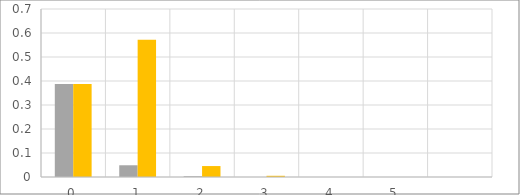
| Category | xi-1-->xi xi-->xr | xi-1-->xr xi-->xi-1 |
|---|---|---|
| 0.0 | 0.387 | 0.387 |
| 1.0 | 0.049 | 0.572 |
| 2.0 | 0.003 | 0.046 |
| 3.0 | 0 | 0.005 |
| 4.0 | 0 | 0 |
| 5.0 | 0 | 0 |